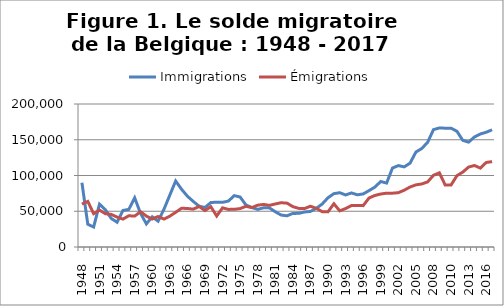
| Category | Immigrations | Émigrations |
|---|---|---|
| 1948 | 89924 | 60061 |
| 1949 | 31795 | 63801 |
| 1950 | 27922 | 46569 |
| 1951 | 59954 | 51620 |
| 1952 | 52150 | 46566 |
| 1953 | 39964 | 45613 |
| 1954 | 34604 | 41834 |
| 1955 | 51106 | 39037 |
| 1956 | 52593 | 43724 |
| 1957 | 68794 | 43221 |
| 1958 | 47124 | 49322 |
| 1959 | 32315 | 43215 |
| 1960 | 42248 | 39127 |
| 1961 | 36088 | 42646 |
| 1962 | 52744 | 39084 |
| 1963 | 72586 | 43161 |
| 1964 | 92334 | 48511 |
| 1965 | 80761 | 54167 |
| 1966 | 71078 | 53887 |
| 1967 | 63713 | 52967 |
| 1968 | 57122 | 56628 |
| 1969 | 55243 | 50988 |
| 1970 | 62143 | 56371 |
| 1971 | 62708 | 43341 |
| 1972 | 62474 | 54791 |
| 1973 | 64250 | 52603 |
| 1974 | 71866 | 52670 |
| 1975 | 69886 | 53739 |
| 1976 | 58724 | 56921 |
| 1977 | 55298 | 55076 |
| 1978 | 52594 | 58495 |
| 1979 | 54854 | 59552 |
| 1980 | 54694 | 58212 |
| 1981 | 49298 | 60194 |
| 1982 | 44659 | 61931 |
| 1983 | 43657 | 61339 |
| 1984 | 47002 | 56447 |
| 1985 | 47042 | 54021 |
| 1986 | 48959 | 53793 |
| 1987 | 49750 | 57033 |
| 1988 | 54048 | 54082 |
| 1989 | 60067 | 49439 |
| 1990 | 68929 | 49246 |
| 1991 | 74617 | 60471 |
| 1992 | 75940 | 50551 |
| 1993 | 72762 | 53824 |
| 1994 | 75621 | 57987 |
| 1995 | 73008 | 58184 |
| 1996 | 74196 | 57867 |
| 1997 | 78878 | 68537 |
| 1998 | 83812 | 72087 |
| 1999 | 91624 | 74097 |
| 2000 | 89388 | 75320 |
| 2001 | 110410 | 75261 |
| 2002 | 113857 | 75960 |
| 2003 | 112060 | 79399 |
| 2004 | 117236 | 83895 |
| 2005 | 132810 | 86899 |
| 2006 | 137699 | 88163 |
| 2007 | 146409 | 91052 |
| 2008 | 164152 | 100275 |
| 2009 | 166479 | 103718 |
| 2010 | 166177 | 86729 |
| 2010 | 166177 | 86729 |
| 2011 | 161881 | 99724 |
| 2012 | 149120 | 104755 |
| 2013 | 146696 | 111853 |
| 2014 | 153948 | 113994 |
| 2015 | 158049 | 110367 |
| 2016 | 160484 | 118245 |
| 2017 | 163918 | 119382 |